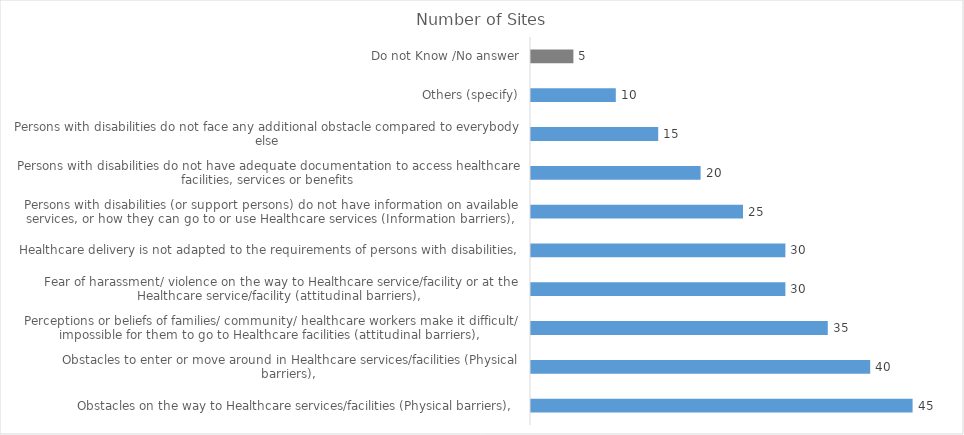
| Category | Additional Obstacles faced by Persons with Disabilities in going to and using Healthcare services |
|---|---|
| Obstacles on the way to Healthcare services/facilities (Physical barriers),  | 45 |
| Obstacles to enter or move around in Healthcare services/facilities (Physical barriers),  | 40 |
| Perceptions or beliefs of families/ community/ healthcare workers make it difficult/ impossible for them to go to Healthcare facilities (attitudinal barriers),  | 35 |
| Fear of harassment/ violence on the way to Healthcare service/facility or at the Healthcare service/facility (attitudinal barriers),  | 30 |
| Healthcare delivery is not adapted to the requirements of persons with disabilities, | 30 |
| Persons with disabilities (or support persons) do not have information on available services, or how they can go to or use Healthcare services (Information barriers),  | 25 |
| Persons with disabilities do not have adequate documentation to access healthcare facilities, services or benefits | 20 |
| Persons with disabilities do not face any additional obstacle compared to everybody else | 15 |
| Others (specify) | 10 |
| Do not Know /No answer | 5 |